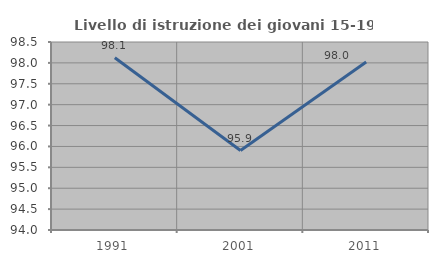
| Category | Livello di istruzione dei giovani 15-19 anni |
|---|---|
| 1991.0 | 98.121 |
| 2001.0 | 95.902 |
| 2011.0 | 98.02 |